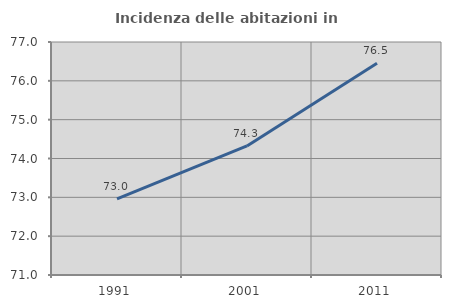
| Category | Incidenza delle abitazioni in proprietà  |
|---|---|
| 1991.0 | 72.961 |
| 2001.0 | 74.323 |
| 2011.0 | 76.453 |